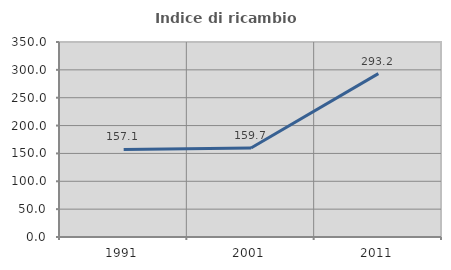
| Category | Indice di ricambio occupazionale  |
|---|---|
| 1991.0 | 157.096 |
| 2001.0 | 159.701 |
| 2011.0 | 293.2 |